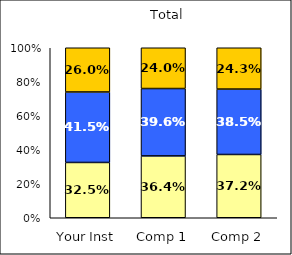
| Category | Low Student-Centered Pedagogy | Average Student-Centered Pedagogy | High Student-Centered Pedagogy |
|---|---|---|---|
| Your Inst | 0.325 | 0.415 | 0.26 |
| Comp 1 | 0.364 | 0.396 | 0.24 |
| Comp 2 | 0.372 | 0.385 | 0.243 |